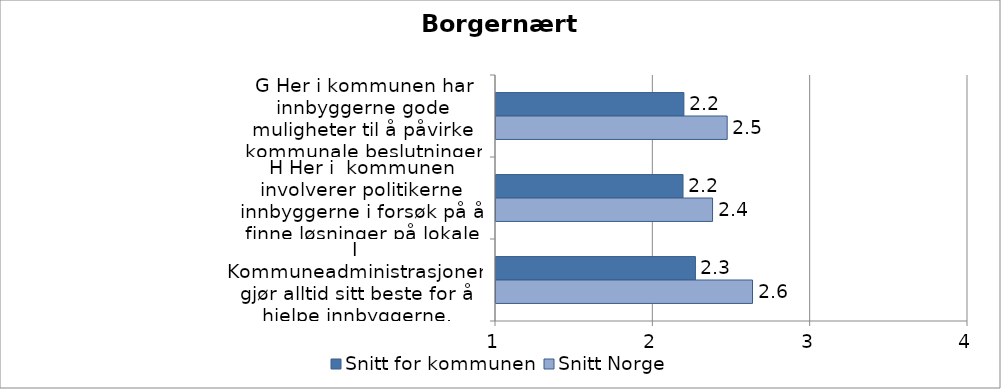
| Category | Snitt for kommunen | Snitt Norge |
|---|---|---|
| G Her i kommunen har innbyggerne gode muligheter til å påvirke kommunale beslutninger som engasjerer dem. | 2.194 | 2.469 |
| H Her i  kommunen involverer politikerne innbyggerne i forsøk på å finne løsninger på lokale problemer | 2.189 | 2.376 |
| I Kommuneadministrasjonen gjør alltid sitt beste for å hjelpe innbyggerne. | 2.268 | 2.63 |